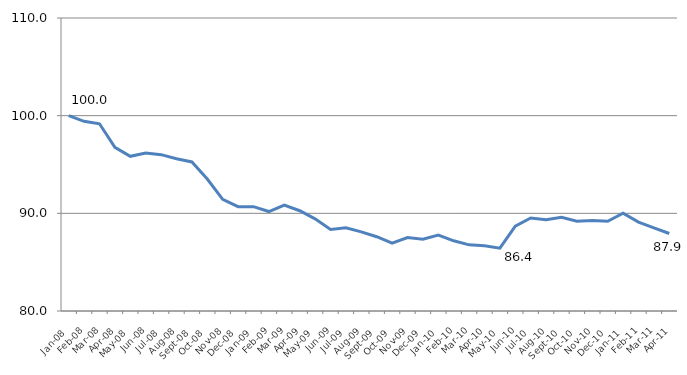
| Category | Series 0 |
|---|---|
| 2008-01-01 | 100 |
| 2008-02-01 | 99.418 |
| 2008-03-01 | 99.168 |
| 2008-04-01 | 96.755 |
| 2008-05-01 | 95.84 |
| 2008-06-01 | 96.173 |
| 2008-07-01 | 96.007 |
| 2008-08-01 | 95.591 |
| 2008-09-01 | 95.258 |
| 2008-10-01 | 93.511 |
| 2008-11-01 | 91.431 |
| 2008-12-01 | 90.682 |
| 2009-01-01 | 90.682 |
| 2009-02-01 | 90.183 |
| 2009-03-01 | 90.849 |
| 2009-04-01 | 90.266 |
| 2009-05-01 | 89.434 |
| 2009-06-01 | 88.353 |
| 2009-07-01 | 88.519 |
| 2009-08-01 | 88.103 |
| 2009-09-01 | 87.604 |
| 2009-10-01 | 86.938 |
| 2009-11-01 | 87.521 |
| 2009-12-01 | 87.354 |
| 2010-01-01 | 87.77 |
| 2010-02-01 | 87.188 |
| 2010-03-01 | 86.772 |
| 2010-04-01 | 86.689 |
| 2010-05-01 | 86.439 |
| 2010-06-01 | 88.686 |
| 2010-07-01 | 89.517 |
| 2010-08-01 | 89.351 |
| 2010-09-01 | 89.601 |
| 2010-10-01 | 89.185 |
| 2010-11-01 | 89.268 |
| 2010-12-01 | 89.185 |
| 2011-01-01 | 90.017 |
| 2011-02-01 | 89.101 |
| 2011-03-01 | 88.519 |
| 2011-04-01 | 87.937 |